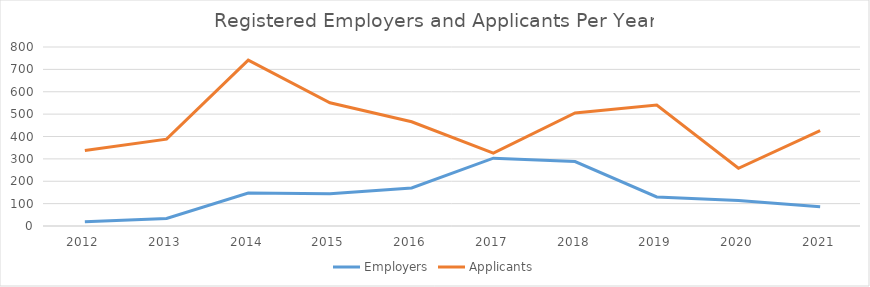
| Category | Employers | Applicants |
|---|---|---|
| 2012.0 | 19 | 337 |
| 2013.0 | 34 | 388 |
| 2014.0 | 147 | 741 |
| 2015.0 | 144 | 551 |
| 2016.0 | 170 | 466 |
| 2017.0 | 303 | 326 |
| 2018.0 | 288 | 505 |
| 2019.0 | 130 | 541 |
| 2020.0 | 114 | 258 |
| 2021.0 | 86 | 426 |